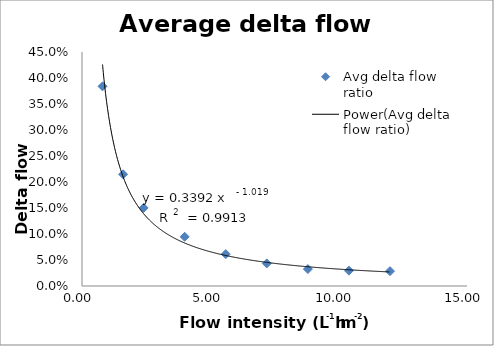
| Category | Avg delta flow ratio |
|---|---|
| 0.8 | 0.384 |
| 1.6 | 0.215 |
| 2.4 | 0.15 |
| 4.0 | 0.095 |
| 5.6 | 0.061 |
| 7.2 | 0.043 |
| 8.8 | 0.033 |
| 10.4 | 0.029 |
| 12.0 | 0.029 |